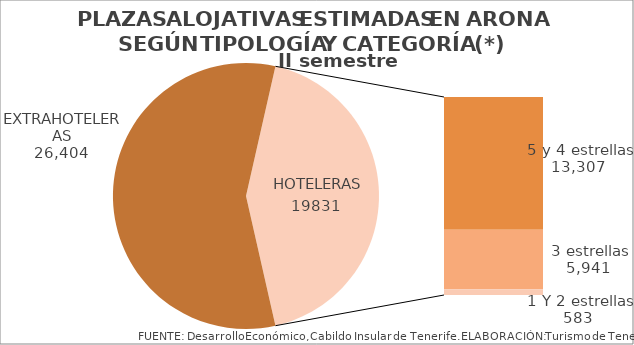
| Category | II semestre 2014 |
|---|---|
| EXTRAHOTELERAS | 26404 |
| 5 y 4 estrellas | 13307 |
| 3 estrellas | 5941 |
| 1 Y 2 estrellas | 583 |